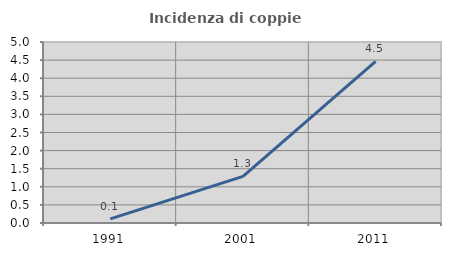
| Category | Incidenza di coppie miste |
|---|---|
| 1991.0 | 0.114 |
| 2001.0 | 1.287 |
| 2011.0 | 4.465 |